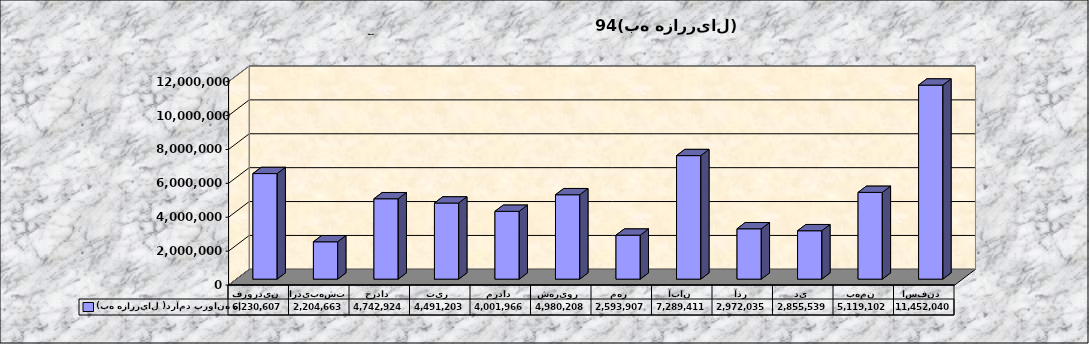
| Category |  (به هزارريال )درآمد پروانه ها |
|---|---|
| فروردین | 6230607 |
| اردیبهشت | 2204663 |
| خرداد | 4742924 |
| تیر | 4491203 |
| مرداد | 4001966 |
| شهریور | 4980208 |
| مهر | 2593907 |
| آبان | 7289411 |
| آذر | 2972035 |
| دی | 2855539 |
| بهمن | 5119102 |
| اسفند | 11452040 |